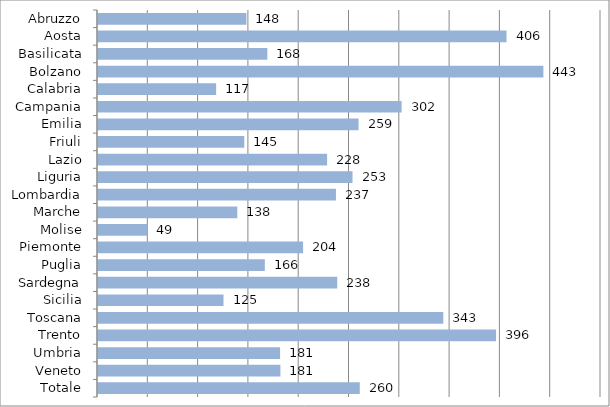
| Category | Series 0 |
|---|---|
| Abruzzo | 147.506 |
| Aosta | 406.094 |
| Basilicata | 168.333 |
| Bolzano | 442.741 |
| Calabria | 117.43 |
| Campania | 301.772 |
| Emilia | 259.016 |
| Friuli | 145.415 |
| Lazio | 227.737 |
| Liguria | 253.012 |
| Lombardia | 236.538 |
| Marche | 138.48 |
| Molise | 49.043 |
| Piemonte | 203.867 |
| Puglia | 165.817 |
| Sardegna | 237.81 |
| Sicilia | 124.771 |
| Toscana | 343.245 |
| Trento | 395.714 |
| Umbria | 180.998 |
| Veneto | 181.318 |
| Totale | 260.219 |